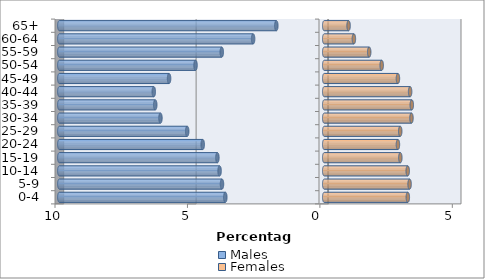
| Category | Males | Females |
|---|---|---|
| 0-4 | -3.734 | 3.156 |
| 5-9 | -3.86 | 3.223 |
| 10-14 | -3.95 | 3.152 |
| 15-19 | -4.033 | 2.873 |
| 20-24 | -4.587 | 2.783 |
| 25-29 | -5.173 | 2.869 |
| 30-34 | -6.183 | 3.294 |
| 35-39 | -6.379 | 3.306 |
| 40-44 | -6.434 | 3.243 |
| 45-49 | -5.857 | 2.783 |
| 50-54 | -4.858 | 2.17 |
| 55-59 | -3.868 | 1.698 |
| 60-64 | -2.685 | 1.12 |
| 65+ | -1.808 | 0.92 |